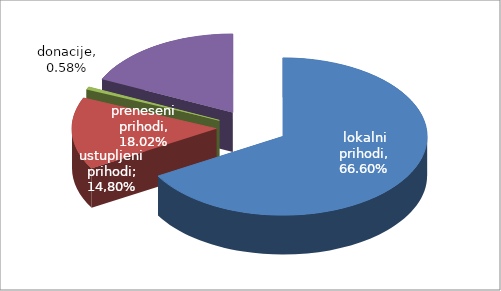
| Category | Series 0 |
|---|---|
| lokalni prihodi | 0.666 |
| ustupljeni prihodi | 0.148 |
| donacije | 0.006 |
| preneseni prihodi | 0.18 |